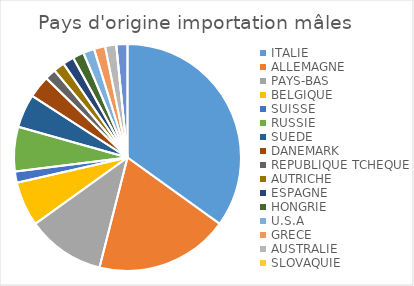
| Category | Series 0 |
|---|---|
| ITALIE | 22 |
| ALLEMAGNE | 12 |
| PAYS-BAS | 7 |
| BELGIQUE | 4 |
| SUISSE | 1 |
| RUSSIE | 4 |
| SUEDE | 3 |
| DANEMARK | 2 |
| REPUBLIQUE TCHEQUE | 1 |
| AUTRICHE | 1 |
| ESPAGNE | 1 |
| HONGRIE | 1 |
| U.S.A | 1 |
| GRECE | 1 |
| AUSTRALIE | 1 |
| SLOVAQUIE | 0 |
| LETTONIE | 1 |